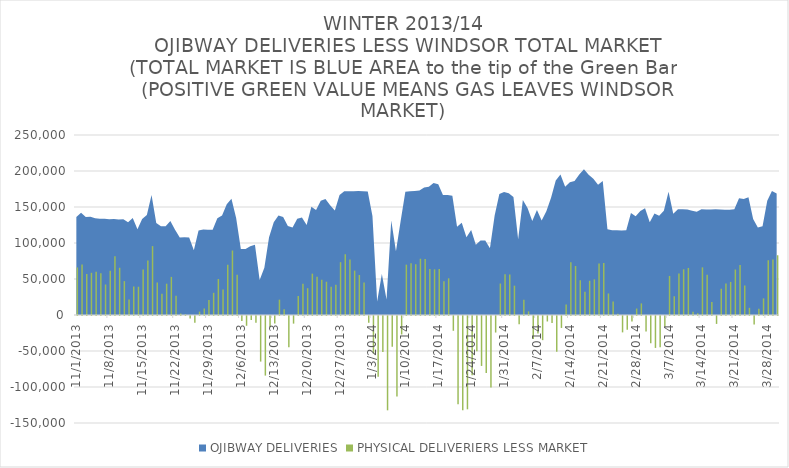
| Category | PHYSICAL DELIVERIERS LESS MARKET |
|---|---|
| 2013-11-01 | 66038.078 |
| 2013-11-02 | 70226.783 |
| 2013-11-03 | 57078.654 |
| 2013-11-04 | 58608.673 |
| 2013-11-05 | 59930.384 |
| 2013-11-06 | 58120.83 |
| 2013-11-07 | 42387.24 |
| 2013-11-08 | 61565.502 |
| 2013-11-09 | 81507.49 |
| 2013-11-10 | 65617.596 |
| 2013-11-11 | 47089.886 |
| 2013-11-12 | 21602.816 |
| 2013-11-13 | 39678.386 |
| 2013-11-14 | 39257.925 |
| 2013-11-15 | 63210.237 |
| 2013-11-16 | 75595.83 |
| 2013-11-17 | 95709.664 |
| 2013-11-18 | 45042.307 |
| 2013-11-19 | 29508.512 |
| 2013-11-20 | 43473.871 |
| 2013-11-21 | 52906.33 |
| 2013-11-22 | 26908.188 |
| 2013-11-23 | 2026.461 |
| 2013-11-24 | 798.553 |
| 2013-11-25 | -3625.101 |
| 2013-11-26 | -9251.573 |
| 2013-11-27 | 4706.829 |
| 2013-11-28 | 9158.116 |
| 2013-11-29 | 20911.706 |
| 2013-11-30 | 30817.203 |
| 2013-12-01 | 49929.244 |
| 2013-12-02 | 35301.329 |
| 2013-12-03 | 69925.098 |
| 2013-12-04 | 89591.929 |
| 2013-12-05 | 55946.998 |
| 2013-12-06 | -7089.299 |
| 2013-12-07 | -13572.322 |
| 2013-12-08 | -5407.782 |
| 2013-12-09 | -9493.895 |
| 2013-12-10 | -63304.918 |
| 2013-12-11 | -82766.323 |
| 2013-12-12 | -15628.482 |
| 2013-12-13 | -10460.02 |
| 2013-12-14 | 21302.994 |
| 2013-12-15 | 7919.95 |
| 2013-12-16 | -43396.874 |
| 2013-12-17 | -10594.709 |
| 2013-12-18 | 26464.021 |
| 2013-12-19 | 43288.133 |
| 2013-12-20 | 37208.869 |
| 2013-12-21 | 57419.275 |
| 2013-12-22 | 53119.73 |
| 2013-12-23 | 49102.817 |
| 2013-12-24 | 46190.396 |
| 2013-12-25 | 39278.774 |
| 2013-12-26 | 42161.926 |
| 2013-12-27 | 73368.599 |
| 2013-12-28 | 84248.776 |
| 2013-12-29 | 76989.828 |
| 2013-12-30 | 61701.977 |
| 2013-12-31 | 55555.661 |
| 2014-01-01 | 45203.685 |
| 2014-01-02 | -9305.827 |
| 2014-01-03 | -52148.028 |
| 2014-01-04 | -84535.036 |
| 2014-01-05 | -49849.098 |
| 2014-01-06 | -130997.775 |
| 2014-01-07 | -42650.994 |
| 2014-01-08 | -111855.671 |
| 2014-01-09 | -25638.777 |
| 2014-01-10 | 69931.312 |
| 2014-01-11 | 71996.801 |
| 2014-01-12 | 70534.267 |
| 2014-01-13 | 78140.064 |
| 2014-01-14 | 77679.872 |
| 2014-01-15 | 64057.68 |
| 2014-01-16 | 63416.511 |
| 2014-01-17 | 63756.258 |
| 2014-01-18 | 46887.062 |
| 2014-01-19 | 50944.18 |
| 2014-01-20 | -20535.633 |
| 2014-01-21 | -122730.689 |
| 2014-01-22 | -131073.495 |
| 2014-01-23 | -129589.799 |
| 2014-01-24 | -82414.307 |
| 2014-01-25 | -48932.708 |
| 2014-01-26 | -69358.375 |
| 2014-01-27 | -79142.799 |
| 2014-01-28 | -99225.618 |
| 2014-01-29 | -22975.04 |
| 2014-01-30 | 43712.691 |
| 2014-01-31 | 56436.372 |
| 2014-02-01 | 56237.963 |
| 2014-02-02 | 40761.237 |
| 2014-02-03 | -11354.803 |
| 2014-02-04 | 21239.848 |
| 2014-02-05 | 5064.886 |
| 2014-02-06 | -31995.537 |
| 2014-02-07 | -24160.547 |
| 2014-02-08 | -33539.976 |
| 2014-02-09 | -7607.503 |
| 2014-02-10 | -9693.073 |
| 2014-02-11 | -49751.738 |
| 2014-02-12 | -16592.024 |
| 2014-02-13 | 14602.206 |
| 2014-02-14 | 73386.496 |
| 2014-02-15 | 68019.088 |
| 2014-02-16 | 48221.803 |
| 2014-02-17 | 32440.357 |
| 2014-02-18 | 47549.642 |
| 2014-02-19 | 49507.171 |
| 2014-02-20 | 71590.484 |
| 2014-02-21 | 72350.463 |
| 2014-02-22 | 29918.203 |
| 2014-02-23 | 18917.266 |
| 2014-02-24 | 1825.567 |
| 2014-02-25 | -22745.887 |
| 2014-02-26 | -18924.018 |
| 2014-02-27 | -7804.837 |
| 2014-02-28 | 8993.791 |
| 2014-03-01 | 16093.72 |
| 2014-03-02 | -21664.674 |
| 2014-03-03 | -37817.583 |
| 2014-03-04 | -44348.629 |
| 2014-03-05 | -43492.463 |
| 2014-03-06 | -15060.37 |
| 2014-03-07 | 54235.093 |
| 2014-03-08 | 25928.796 |
| 2014-03-09 | 57692.31 |
| 2014-03-10 | 63440.683 |
| 2014-03-11 | 65348.492 |
| 2014-03-12 | 4353.825 |
| 2014-03-13 | 2384.856 |
| 2014-03-14 | 66152.302 |
| 2014-03-15 | 56059.01 |
| 2014-03-16 | 18215.429 |
| 2014-03-17 | -10986.591 |
| 2014-03-18 | 36337.529 |
| 2014-03-19 | 43611.278 |
| 2014-03-20 | 45932.929 |
| 2014-03-21 | 63194.065 |
| 2014-03-22 | 69532.282 |
| 2014-03-23 | 40983.455 |
| 2014-03-24 | 9981.965 |
| 2014-03-25 | -11913.047 |
| 2014-03-26 | 8586.344 |
| 2014-03-27 | 23088.015 |
| 2014-03-28 | 76161.247 |
| 2014-03-29 | 77209.667 |
| 2014-03-30 | 82972.47 |